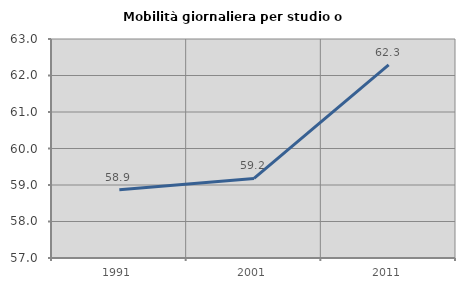
| Category | Mobilità giornaliera per studio o lavoro |
|---|---|
| 1991.0 | 58.871 |
| 2001.0 | 59.18 |
| 2011.0 | 62.289 |